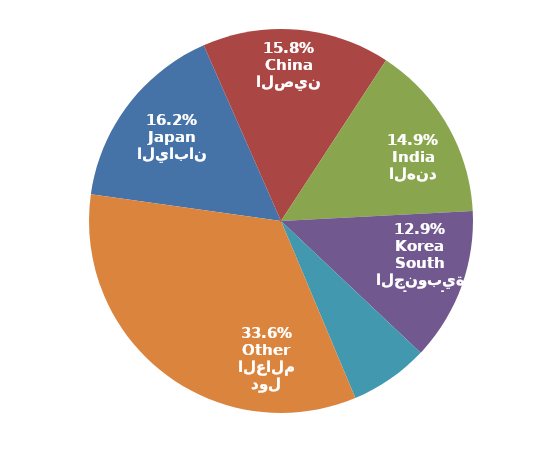
| Category | Series 0 |
|---|---|
| اليابان
Japan | 7939 |
| الصين
China | 7755 |
| الهند
India | 7333 |
| كوريا الجنوبية
South Korea | 6316 |
| سنغافورة
Singapore | 3254 |
|  بقية دول العالم
Other | 16458 |